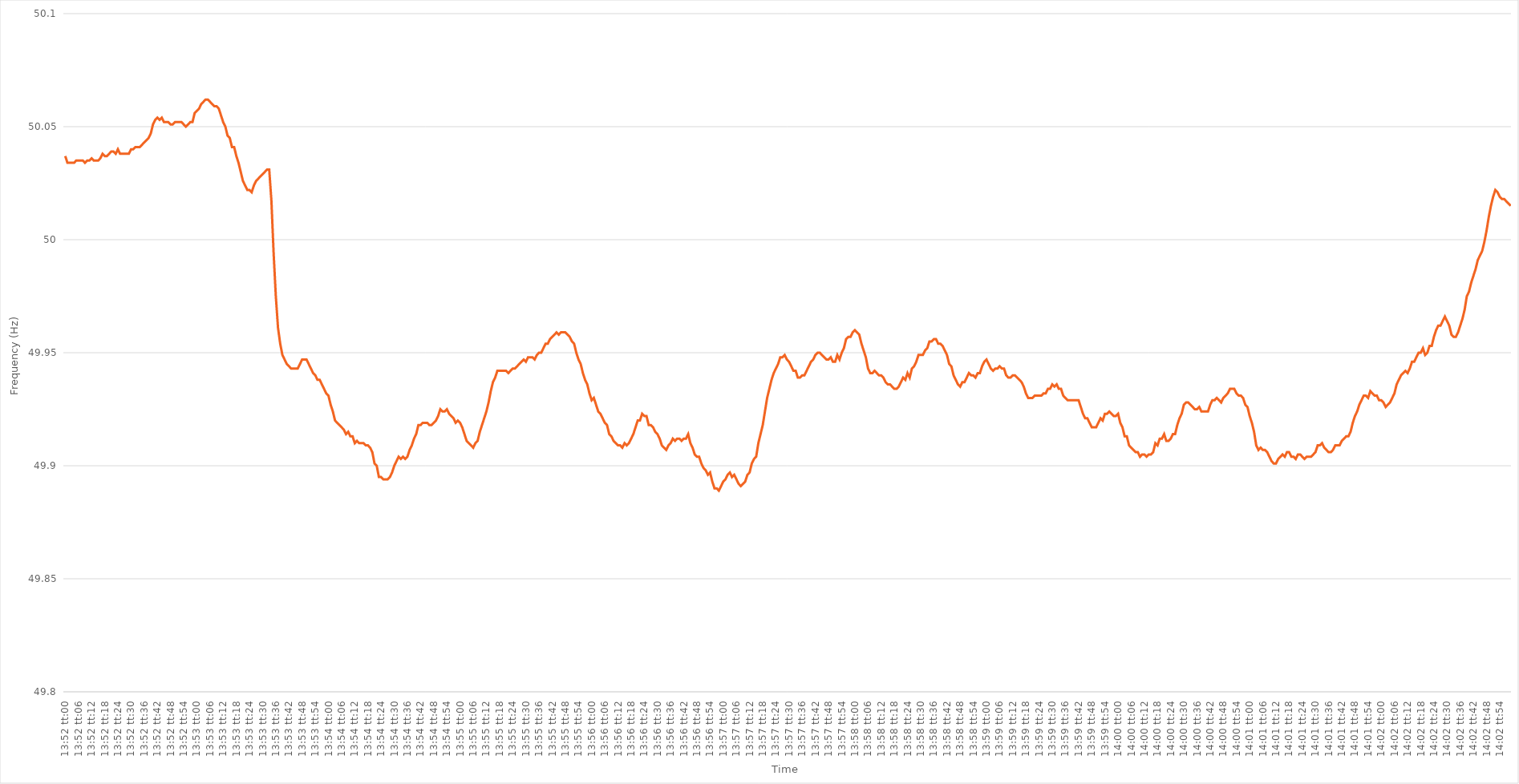
| Category | Series 0 |
|---|---|
| 0.5777777777777778 | 50.037 |
| 0.5777893518518519 | 50.034 |
| 0.5778009259259259 | 50.034 |
| 0.5778125 | 50.034 |
| 0.5778240740740741 | 50.034 |
| 0.5778356481481481 | 50.035 |
| 0.5778472222222223 | 50.035 |
| 0.5778587962962963 | 50.035 |
| 0.5778703703703704 | 50.035 |
| 0.5778819444444444 | 50.034 |
| 0.5778935185185184 | 50.035 |
| 0.5779050925925926 | 50.035 |
| 0.5779166666666666 | 50.036 |
| 0.5779282407407408 | 50.035 |
| 0.5779398148148148 | 50.035 |
| 0.5779513888888889 | 50.035 |
| 0.5779629629629629 | 50.036 |
| 0.577974537037037 | 50.038 |
| 0.5779861111111111 | 50.037 |
| 0.5779976851851852 | 50.037 |
| 0.5780092592592593 | 50.038 |
| 0.5780208333333333 | 50.039 |
| 0.5780324074074074 | 50.039 |
| 0.5780439814814815 | 50.038 |
| 0.5780555555555555 | 50.04 |
| 0.5780671296296297 | 50.038 |
| 0.5780787037037037 | 50.038 |
| 0.5780902777777778 | 50.038 |
| 0.5781018518518518 | 50.038 |
| 0.578113425925926 | 50.038 |
| 0.578125 | 50.04 |
| 0.578136574074074 | 50.04 |
| 0.5781481481481482 | 50.041 |
| 0.5781597222222222 | 50.041 |
| 0.5781712962962963 | 50.041 |
| 0.5781828703703703 | 50.042 |
| 0.5781944444444445 | 50.043 |
| 0.5782060185185185 | 50.044 |
| 0.5782175925925926 | 50.045 |
| 0.5782291666666667 | 50.047 |
| 0.5782407407407407 | 50.051 |
| 0.5782523148148148 | 50.053 |
| 0.5782638888888889 | 50.054 |
| 0.578275462962963 | 50.053 |
| 0.5782870370370371 | 50.054 |
| 0.5782986111111111 | 50.052 |
| 0.5783101851851852 | 50.052 |
| 0.5783217592592592 | 50.052 |
| 0.5783333333333334 | 50.051 |
| 0.5783449074074074 | 50.051 |
| 0.5783564814814816 | 50.052 |
| 0.5783680555555556 | 50.052 |
| 0.5783796296296296 | 50.052 |
| 0.5783912037037037 | 50.052 |
| 0.5784027777777777 | 50.051 |
| 0.5784143518518519 | 50.05 |
| 0.5784259259259259 | 50.051 |
| 0.5784375 | 50.052 |
| 0.5784490740740741 | 50.052 |
| 0.5784606481481481 | 50.056 |
| 0.5784722222222222 | 50.057 |
| 0.5784837962962963 | 50.058 |
| 0.5784953703703704 | 50.06 |
| 0.5785069444444445 | 50.061 |
| 0.5785185185185185 | 50.062 |
| 0.5785300925925926 | 50.062 |
| 0.5785416666666666 | 50.061 |
| 0.5785532407407408 | 50.06 |
| 0.5785648148148148 | 50.059 |
| 0.578576388888889 | 50.059 |
| 0.578587962962963 | 50.058 |
| 0.578599537037037 | 50.055 |
| 0.5786111111111111 | 50.052 |
| 0.5786226851851851 | 50.05 |
| 0.5786342592592593 | 50.046 |
| 0.5786458333333333 | 50.045 |
| 0.5786574074074075 | 50.041 |
| 0.5786689814814815 | 50.041 |
| 0.5786805555555555 | 50.037 |
| 0.5786921296296296 | 50.034 |
| 0.5787037037037037 | 50.03 |
| 0.5787152777777778 | 50.026 |
| 0.5787268518518519 | 50.024 |
| 0.578738425925926 | 50.022 |
| 0.57875 | 50.022 |
| 0.578761574074074 | 50.021 |
| 0.5787731481481482 | 50.024 |
| 0.5787847222222222 | 50.026 |
| 0.5787962962962964 | 50.027 |
| 0.5788078703703704 | 50.028 |
| 0.5788194444444444 | 50.029 |
| 0.5788310185185185 | 50.03 |
| 0.5788425925925925 | 50.031 |
| 0.5788541666666667 | 50.031 |
| 0.5788657407407407 | 50.017 |
| 0.5788773148148149 | 49.994 |
| 0.5788888888888889 | 49.975 |
| 0.5789004629629629 | 49.961 |
| 0.578912037037037 | 49.954 |
| 0.5789236111111111 | 49.949 |
| 0.5789351851851852 | 49.947 |
| 0.5789467592592593 | 49.945 |
| 0.5789583333333334 | 49.944 |
| 0.5789699074074074 | 49.943 |
| 0.5789814814814814 | 49.943 |
| 0.5789930555555556 | 49.943 |
| 0.5790046296296296 | 49.943 |
| 0.5790162037037038 | 49.945 |
| 0.5790277777777778 | 49.947 |
| 0.5790393518518518 | 49.947 |
| 0.5790509259259259 | 49.947 |
| 0.5790625 | 49.945 |
| 0.5790740740740741 | 49.943 |
| 0.5790856481481481 | 49.941 |
| 0.5790972222222223 | 49.94 |
| 0.5791087962962963 | 49.938 |
| 0.5791203703703703 | 49.938 |
| 0.5791319444444444 | 49.936 |
| 0.5791435185185185 | 49.934 |
| 0.5791550925925926 | 49.932 |
| 0.5791666666666667 | 49.931 |
| 0.5791782407407408 | 49.927 |
| 0.5791898148148148 | 49.924 |
| 0.5792013888888888 | 49.92 |
| 0.579212962962963 | 49.919 |
| 0.579224537037037 | 49.918 |
| 0.5792361111111112 | 49.917 |
| 0.5792476851851852 | 49.916 |
| 0.5792592592592593 | 49.914 |
| 0.5792708333333333 | 49.915 |
| 0.5792824074074074 | 49.913 |
| 0.5792939814814815 | 49.913 |
| 0.5793055555555556 | 49.91 |
| 0.5793171296296297 | 49.911 |
| 0.5793287037037037 | 49.91 |
| 0.5793402777777777 | 49.91 |
| 0.5793518518518518 | 49.91 |
| 0.5793634259259259 | 49.909 |
| 0.579375 | 49.909 |
| 0.5793865740740741 | 49.908 |
| 0.5793981481481482 | 49.906 |
| 0.5794097222222222 | 49.901 |
| 0.5794212962962962 | 49.9 |
| 0.5794328703703704 | 49.895 |
| 0.5794444444444444 | 49.895 |
| 0.5794560185185186 | 49.894 |
| 0.5794675925925926 | 49.894 |
| 0.5794791666666667 | 49.894 |
| 0.5794907407407407 | 49.895 |
| 0.5795023148148148 | 49.897 |
| 0.5795138888888889 | 49.9 |
| 0.579525462962963 | 49.902 |
| 0.5795370370370371 | 49.904 |
| 0.5795486111111111 | 49.903 |
| 0.5795601851851852 | 49.904 |
| 0.5795717592592592 | 49.903 |
| 0.5795833333333333 | 49.904 |
| 0.5795949074074074 | 49.907 |
| 0.5796064814814815 | 49.909 |
| 0.5796180555555556 | 49.912 |
| 0.5796296296296296 | 49.914 |
| 0.5796412037037036 | 49.918 |
| 0.5796527777777778 | 49.918 |
| 0.5796643518518518 | 49.919 |
| 0.579675925925926 | 49.919 |
| 0.5796875 | 49.919 |
| 0.5796990740740741 | 49.918 |
| 0.5797106481481481 | 49.918 |
| 0.5797222222222222 | 49.919 |
| 0.5797337962962963 | 49.92 |
| 0.5797453703703704 | 49.922 |
| 0.5797569444444445 | 49.925 |
| 0.5797685185185185 | 49.924 |
| 0.5797800925925926 | 49.924 |
| 0.5797916666666666 | 49.925 |
| 0.5798032407407407 | 49.923 |
| 0.5798148148148148 | 49.922 |
| 0.5798263888888889 | 49.921 |
| 0.579837962962963 | 49.919 |
| 0.579849537037037 | 49.92 |
| 0.579861111111111 | 49.919 |
| 0.5798726851851852 | 49.917 |
| 0.5798842592592592 | 49.914 |
| 0.5798958333333334 | 49.911 |
| 0.5799074074074074 | 49.91 |
| 0.5799189814814815 | 49.909 |
| 0.5799305555555555 | 49.908 |
| 0.5799421296296297 | 49.91 |
| 0.5799537037037037 | 49.911 |
| 0.5799652777777778 | 49.915 |
| 0.5799768518518519 | 49.918 |
| 0.5799884259259259 | 49.921 |
| 0.58 | 49.924 |
| 0.5800115740740741 | 49.928 |
| 0.5800231481481481 | 49.933 |
| 0.5800347222222222 | 49.937 |
| 0.5800462962962963 | 49.939 |
| 0.5800578703703704 | 49.942 |
| 0.5800694444444444 | 49.942 |
| 0.5800810185185185 | 49.942 |
| 0.5800925925925926 | 49.942 |
| 0.5801041666666666 | 49.942 |
| 0.5801157407407408 | 49.941 |
| 0.5801273148148148 | 49.942 |
| 0.5801388888888889 | 49.943 |
| 0.5801504629629629 | 49.943 |
| 0.5801620370370371 | 49.944 |
| 0.5801736111111111 | 49.945 |
| 0.5801851851851852 | 49.946 |
| 0.5801967592592593 | 49.947 |
| 0.5802083333333333 | 49.946 |
| 0.5802199074074074 | 49.948 |
| 0.5802314814814815 | 49.948 |
| 0.5802430555555556 | 49.948 |
| 0.5802546296296297 | 49.947 |
| 0.5802662037037037 | 49.949 |
| 0.5802777777777778 | 49.95 |
| 0.5802893518518518 | 49.95 |
| 0.5803009259259259 | 49.952 |
| 0.5803125 | 49.954 |
| 0.580324074074074 | 49.954 |
| 0.5803356481481482 | 49.956 |
| 0.5803472222222222 | 49.957 |
| 0.5803587962962963 | 49.958 |
| 0.5803703703703703 | 49.959 |
| 0.5803819444444445 | 49.958 |
| 0.5803935185185185 | 49.959 |
| 0.5804050925925927 | 49.959 |
| 0.5804166666666667 | 49.959 |
| 0.5804282407407407 | 49.958 |
| 0.5804398148148148 | 49.957 |
| 0.5804513888888889 | 49.955 |
| 0.580462962962963 | 49.954 |
| 0.5804745370370371 | 49.95 |
| 0.5804861111111111 | 49.947 |
| 0.5804976851851852 | 49.945 |
| 0.5805092592592592 | 49.941 |
| 0.5805208333333333 | 49.938 |
| 0.5805324074074074 | 49.936 |
| 0.5805439814814815 | 49.932 |
| 0.5805555555555556 | 49.929 |
| 0.5805671296296296 | 49.93 |
| 0.5805787037037037 | 49.927 |
| 0.5805902777777777 | 49.924 |
| 0.5806018518518519 | 49.923 |
| 0.5806134259259259 | 49.921 |
| 0.5806250000000001 | 49.919 |
| 0.5806365740740741 | 49.918 |
| 0.5806481481481481 | 49.914 |
| 0.5806597222222222 | 49.913 |
| 0.5806712962962963 | 49.911 |
| 0.5806828703703704 | 49.91 |
| 0.5806944444444445 | 49.909 |
| 0.5807060185185186 | 49.909 |
| 0.5807175925925926 | 49.908 |
| 0.5807291666666666 | 49.91 |
| 0.5807407407407407 | 49.909 |
| 0.5807523148148148 | 49.91 |
| 0.5807638888888889 | 49.912 |
| 0.580775462962963 | 49.914 |
| 0.580787037037037 | 49.917 |
| 0.5807986111111111 | 49.92 |
| 0.5808101851851851 | 49.92 |
| 0.5808217592592593 | 49.923 |
| 0.5808333333333333 | 49.922 |
| 0.5808449074074075 | 49.922 |
| 0.5808564814814815 | 49.918 |
| 0.5808680555555555 | 49.918 |
| 0.5808796296296296 | 49.917 |
| 0.5808912037037037 | 49.915 |
| 0.5809027777777778 | 49.914 |
| 0.5809143518518519 | 49.912 |
| 0.580925925925926 | 49.909 |
| 0.5809375 | 49.908 |
| 0.580949074074074 | 49.907 |
| 0.5809606481481482 | 49.909 |
| 0.5809722222222222 | 49.91 |
| 0.5809837962962963 | 49.912 |
| 0.5809953703703704 | 49.911 |
| 0.5810069444444445 | 49.912 |
| 0.5810185185185185 | 49.912 |
| 0.5810300925925925 | 49.911 |
| 0.5810416666666667 | 49.912 |
| 0.5810532407407407 | 49.912 |
| 0.5810648148148149 | 49.914 |
| 0.5810763888888889 | 49.91 |
| 0.581087962962963 | 49.908 |
| 0.581099537037037 | 49.905 |
| 0.5811111111111111 | 49.904 |
| 0.5811226851851852 | 49.904 |
| 0.5811342592592593 | 49.901 |
| 0.5811458333333334 | 49.899 |
| 0.5811574074074074 | 49.898 |
| 0.5811689814814814 | 49.896 |
| 0.5811805555555556 | 49.897 |
| 0.5811921296296296 | 49.893 |
| 0.5812037037037037 | 49.89 |
| 0.5812152777777778 | 49.89 |
| 0.5812268518518519 | 49.889 |
| 0.5812384259259259 | 49.891 |
| 0.5812499999999999 | 49.893 |
| 0.5812615740740741 | 49.894 |
| 0.5812731481481481 | 49.896 |
| 0.5812847222222223 | 49.897 |
| 0.5812962962962963 | 49.895 |
| 0.5813078703703703 | 49.896 |
| 0.5813194444444444 | 49.894 |
| 0.5813310185185185 | 49.892 |
| 0.5813425925925926 | 49.891 |
| 0.5813541666666667 | 49.892 |
| 0.5813657407407408 | 49.893 |
| 0.5813773148148148 | 49.896 |
| 0.5813888888888888 | 49.897 |
| 0.581400462962963 | 49.901 |
| 0.581412037037037 | 49.903 |
| 0.5814236111111112 | 49.904 |
| 0.5814351851851852 | 49.91 |
| 0.5814467592592593 | 49.914 |
| 0.5814583333333333 | 49.918 |
| 0.5814699074074073 | 49.924 |
| 0.5814814814814815 | 49.93 |
| 0.5814930555555555 | 49.934 |
| 0.5815046296296297 | 49.938 |
| 0.5815162037037037 | 49.941 |
| 0.5815277777777778 | 49.943 |
| 0.5815393518518518 | 49.945 |
| 0.5815509259259259 | 49.948 |
| 0.5815625 | 49.948 |
| 0.5815740740740741 | 49.949 |
| 0.5815856481481482 | 49.947 |
| 0.5815972222222222 | 49.946 |
| 0.5816087962962962 | 49.944 |
| 0.5816203703703704 | 49.942 |
| 0.5816319444444444 | 49.942 |
| 0.5816435185185186 | 49.939 |
| 0.5816550925925926 | 49.939 |
| 0.5816666666666667 | 49.94 |
| 0.5816782407407407 | 49.94 |
| 0.5816898148148147 | 49.942 |
| 0.5817013888888889 | 49.944 |
| 0.5817129629629629 | 49.946 |
| 0.5817245370370371 | 49.947 |
| 0.5817361111111111 | 49.949 |
| 0.5817476851851852 | 49.95 |
| 0.5817592592592592 | 49.95 |
| 0.5817708333333333 | 49.949 |
| 0.5817824074074074 | 49.948 |
| 0.5817939814814815 | 49.947 |
| 0.5818055555555556 | 49.947 |
| 0.5818171296296296 | 49.948 |
| 0.5818287037037037 | 49.946 |
| 0.5818402777777778 | 49.946 |
| 0.5818518518518518 | 49.949 |
| 0.581863425925926 | 49.947 |
| 0.581875 | 49.95 |
| 0.5818865740740741 | 49.952 |
| 0.5818981481481481 | 49.956 |
| 0.5819097222222223 | 49.957 |
| 0.5819212962962963 | 49.957 |
| 0.5819328703703703 | 49.959 |
| 0.5819444444444445 | 49.96 |
| 0.5819560185185185 | 49.959 |
| 0.5819675925925926 | 49.958 |
| 0.5819791666666666 | 49.954 |
| 0.5819907407407408 | 49.951 |
| 0.5820023148148148 | 49.948 |
| 0.5820138888888889 | 49.943 |
| 0.582025462962963 | 49.941 |
| 0.582037037037037 | 49.941 |
| 0.5820486111111111 | 49.942 |
| 0.5820601851851852 | 49.941 |
| 0.5820717592592592 | 49.94 |
| 0.5820833333333334 | 49.94 |
| 0.5820949074074074 | 49.939 |
| 0.5821064814814815 | 49.937 |
| 0.5821180555555555 | 49.936 |
| 0.5821296296296297 | 49.936 |
| 0.5821412037037037 | 49.935 |
| 0.5821527777777777 | 49.934 |
| 0.5821643518518519 | 49.934 |
| 0.5821759259259259 | 49.935 |
| 0.5821875 | 49.937 |
| 0.582199074074074 | 49.939 |
| 0.5822106481481482 | 49.938 |
| 0.5822222222222222 | 49.941 |
| 0.5822337962962963 | 49.939 |
| 0.5822453703703704 | 49.943 |
| 0.5822569444444444 | 49.944 |
| 0.5822685185185185 | 49.946 |
| 0.5822800925925926 | 49.949 |
| 0.5822916666666667 | 49.949 |
| 0.5823032407407408 | 49.949 |
| 0.5823148148148148 | 49.951 |
| 0.5823263888888889 | 49.952 |
| 0.5823379629629629 | 49.955 |
| 0.5823495370370371 | 49.955 |
| 0.5823611111111111 | 49.956 |
| 0.5823726851851853 | 49.956 |
| 0.5823842592592593 | 49.954 |
| 0.5823958333333333 | 49.954 |
| 0.5824074074074074 | 49.953 |
| 0.5824189814814814 | 49.951 |
| 0.5824305555555556 | 49.949 |
| 0.5824421296296296 | 49.945 |
| 0.5824537037037038 | 49.944 |
| 0.5824652777777778 | 49.94 |
| 0.5824768518518518 | 49.938 |
| 0.5824884259259259 | 49.936 |
| 0.5825 | 49.935 |
| 0.5825115740740741 | 49.937 |
| 0.5825231481481482 | 49.937 |
| 0.5825347222222222 | 49.939 |
| 0.5825462962962963 | 49.941 |
| 0.5825578703703703 | 49.94 |
| 0.5825694444444445 | 49.94 |
| 0.5825810185185185 | 49.939 |
| 0.5825925925925927 | 49.941 |
| 0.5826041666666667 | 49.941 |
| 0.5826157407407407 | 49.944 |
| 0.5826273148148148 | 49.946 |
| 0.5826388888888888 | 49.947 |
| 0.582650462962963 | 49.945 |
| 0.582662037037037 | 49.943 |
| 0.5826736111111112 | 49.942 |
| 0.5826851851851852 | 49.943 |
| 0.5826967592592592 | 49.943 |
| 0.5827083333333333 | 49.944 |
| 0.5827199074074074 | 49.943 |
| 0.5827314814814815 | 49.943 |
| 0.5827430555555556 | 49.94 |
| 0.5827546296296297 | 49.939 |
| 0.5827662037037037 | 49.939 |
| 0.5827777777777777 | 49.94 |
| 0.5827893518518519 | 49.94 |
| 0.5828009259259259 | 49.939 |
| 0.5828125000000001 | 49.938 |
| 0.5828240740740741 | 49.937 |
| 0.5828356481481481 | 49.935 |
| 0.5828472222222222 | 49.932 |
| 0.5828587962962963 | 49.93 |
| 0.5828703703703704 | 49.93 |
| 0.5828819444444444 | 49.93 |
| 0.5828935185185186 | 49.931 |
| 0.5829050925925926 | 49.931 |
| 0.5829166666666666 | 49.931 |
| 0.5829282407407407 | 49.931 |
| 0.5829398148148148 | 49.932 |
| 0.5829513888888889 | 49.932 |
| 0.582962962962963 | 49.934 |
| 0.582974537037037 | 49.934 |
| 0.5829861111111111 | 49.936 |
| 0.5829976851851851 | 49.935 |
| 0.5830092592592593 | 49.936 |
| 0.5830208333333333 | 49.934 |
| 0.5830324074074075 | 49.934 |
| 0.5830439814814815 | 49.931 |
| 0.5830555555555555 | 49.93 |
| 0.5830671296296296 | 49.929 |
| 0.5830787037037037 | 49.929 |
| 0.5830902777777778 | 49.929 |
| 0.5831018518518518 | 49.929 |
| 0.583113425925926 | 49.929 |
| 0.583125 | 49.929 |
| 0.583136574074074 | 49.926 |
| 0.5831481481481481 | 49.923 |
| 0.5831597222222222 | 49.921 |
| 0.5831712962962963 | 49.921 |
| 0.5831828703703704 | 49.919 |
| 0.5831944444444445 | 49.917 |
| 0.5832060185185185 | 49.917 |
| 0.5832175925925925 | 49.917 |
| 0.5832291666666667 | 49.919 |
| 0.5832407407407407 | 49.921 |
| 0.5832523148148149 | 49.92 |
| 0.5832638888888889 | 49.923 |
| 0.583275462962963 | 49.923 |
| 0.583287037037037 | 49.924 |
| 0.5832986111111111 | 49.923 |
| 0.5833101851851852 | 49.922 |
| 0.5833217592592593 | 49.922 |
| 0.5833333333333334 | 49.923 |
| 0.5833449074074074 | 49.919 |
| 0.5833564814814814 | 49.917 |
| 0.5833680555555555 | 49.913 |
| 0.5833796296296296 | 49.913 |
| 0.5833912037037037 | 49.909 |
| 0.5834027777777778 | 49.908 |
| 0.5834143518518519 | 49.907 |
| 0.5834259259259259 | 49.906 |
| 0.5834374999999999 | 49.906 |
| 0.5834490740740741 | 49.904 |
| 0.5834606481481481 | 49.905 |
| 0.5834722222222223 | 49.905 |
| 0.5834837962962963 | 49.904 |
| 0.5834953703703704 | 49.905 |
| 0.5835069444444444 | 49.905 |
| 0.5835185185185185 | 49.906 |
| 0.5835300925925926 | 49.91 |
| 0.5835416666666667 | 49.909 |
| 0.5835532407407408 | 49.912 |
| 0.5835648148148148 | 49.912 |
| 0.5835763888888889 | 49.914 |
| 0.5835879629629629 | 49.911 |
| 0.583599537037037 | 49.911 |
| 0.5836111111111111 | 49.912 |
| 0.5836226851851852 | 49.914 |
| 0.5836342592592593 | 49.914 |
| 0.5836458333333333 | 49.918 |
| 0.5836574074074073 | 49.921 |
| 0.5836689814814815 | 49.923 |
| 0.5836805555555555 | 49.927 |
| 0.5836921296296297 | 49.928 |
| 0.5837037037037037 | 49.928 |
| 0.5837152777777778 | 49.927 |
| 0.5837268518518518 | 49.926 |
| 0.583738425925926 | 49.925 |
| 0.58375 | 49.925 |
| 0.5837615740740741 | 49.926 |
| 0.5837731481481482 | 49.924 |
| 0.5837847222222222 | 49.924 |
| 0.5837962962962963 | 49.924 |
| 0.5838078703703703 | 49.924 |
| 0.5838194444444444 | 49.927 |
| 0.5838310185185185 | 49.929 |
| 0.5838425925925926 | 49.929 |
| 0.5838541666666667 | 49.93 |
| 0.5838657407407407 | 49.929 |
| 0.5838773148148148 | 49.928 |
| 0.5838888888888889 | 49.93 |
| 0.5839004629629629 | 49.931 |
| 0.5839120370370371 | 49.932 |
| 0.5839236111111111 | 49.934 |
| 0.5839351851851852 | 49.934 |
| 0.5839467592592592 | 49.934 |
| 0.5839583333333334 | 49.932 |
| 0.5839699074074074 | 49.931 |
| 0.5839814814814815 | 49.931 |
| 0.5839930555555556 | 49.93 |
| 0.5840046296296296 | 49.927 |
| 0.5840162037037037 | 49.926 |
| 0.5840277777777778 | 49.922 |
| 0.5840393518518519 | 49.919 |
| 0.5840509259259259 | 49.915 |
| 0.5840625 | 49.909 |
| 0.5840740740740741 | 49.907 |
| 0.5840856481481481 | 49.908 |
| 0.5840972222222222 | 49.907 |
| 0.5841087962962963 | 49.907 |
| 0.5841203703703703 | 49.906 |
| 0.5841319444444445 | 49.904 |
| 0.5841435185185185 | 49.902 |
| 0.5841550925925926 | 49.901 |
| 0.5841666666666666 | 49.901 |
| 0.5841782407407408 | 49.903 |
| 0.5841898148148148 | 49.904 |
| 0.584201388888889 | 49.905 |
| 0.584212962962963 | 49.904 |
| 0.584224537037037 | 49.906 |
| 0.5842361111111111 | 49.906 |
| 0.5842476851851852 | 49.904 |
| 0.5842592592592593 | 49.904 |
| 0.5842708333333334 | 49.903 |
| 0.5842824074074074 | 49.905 |
| 0.5842939814814815 | 49.905 |
| 0.5843055555555555 | 49.904 |
| 0.5843171296296296 | 49.903 |
| 0.5843287037037037 | 49.904 |
| 0.5843402777777778 | 49.904 |
| 0.5843518518518519 | 49.904 |
| 0.5843634259259259 | 49.905 |
| 0.584375 | 49.906 |
| 0.584386574074074 | 49.909 |
| 0.5843981481481482 | 49.909 |
| 0.5844097222222222 | 49.91 |
| 0.5844212962962964 | 49.908 |
| 0.5844328703703704 | 49.907 |
| 0.5844444444444444 | 49.906 |
| 0.5844560185185185 | 49.906 |
| 0.5844675925925926 | 49.907 |
| 0.5844791666666667 | 49.909 |
| 0.5844907407407408 | 49.909 |
| 0.5845023148148148 | 49.909 |
| 0.5845138888888889 | 49.911 |
| 0.5845254629629629 | 49.912 |
| 0.584537037037037 | 49.913 |
| 0.5845486111111111 | 49.913 |
| 0.5845601851851852 | 49.915 |
| 0.5845717592592593 | 49.919 |
| 0.5845833333333333 | 49.922 |
| 0.5845949074074074 | 49.924 |
| 0.5846064814814814 | 49.927 |
| 0.5846180555555556 | 49.929 |
| 0.5846296296296296 | 49.931 |
| 0.5846412037037038 | 49.931 |
| 0.5846527777777778 | 49.93 |
| 0.5846643518518518 | 49.933 |
| 0.5846759259259259 | 49.932 |
| 0.5846875 | 49.931 |
| 0.5846990740740741 | 49.931 |
| 0.5847106481481482 | 49.929 |
| 0.5847222222222223 | 49.929 |
| 0.5847337962962963 | 49.928 |
| 0.5847453703703703 | 49.926 |
| 0.5847569444444444 | 49.927 |
| 0.5847685185185185 | 49.928 |
| 0.5847800925925926 | 49.93 |
| 0.5847916666666667 | 49.932 |
| 0.5848032407407407 | 49.936 |
| 0.5848148148148148 | 49.938 |
| 0.5848263888888888 | 49.94 |
| 0.584837962962963 | 49.941 |
| 0.584849537037037 | 49.942 |
| 0.5848611111111112 | 49.941 |
| 0.5848726851851852 | 49.943 |
| 0.5848842592592592 | 49.946 |
| 0.5848958333333333 | 49.946 |
| 0.5849074074074074 | 49.948 |
| 0.5849189814814815 | 49.95 |
| 0.5849305555555556 | 49.95 |
| 0.5849421296296297 | 49.952 |
| 0.5849537037037037 | 49.949 |
| 0.5849652777777777 | 49.95 |
| 0.5849768518518519 | 49.953 |
| 0.5849884259259259 | 49.953 |
| 0.585 | 49.957 |
| 0.5850115740740741 | 49.96 |
| 0.5850231481481482 | 49.962 |
| 0.5850347222222222 | 49.962 |
| 0.5850462962962962 | 49.964 |
| 0.5850578703703704 | 49.966 |
| 0.5850694444444444 | 49.964 |
| 0.5850810185185186 | 49.962 |
| 0.5850925925925926 | 49.958 |
| 0.5851041666666666 | 49.957 |
| 0.5851157407407407 | 49.957 |
| 0.5851273148148148 | 49.959 |
| 0.5851388888888889 | 49.962 |
| 0.585150462962963 | 49.965 |
| 0.5851620370370371 | 49.969 |
| 0.5851736111111111 | 49.975 |
| 0.5851851851851851 | 49.977 |
| 0.5851967592592593 | 49.981 |
| 0.5852083333333333 | 49.984 |
| 0.5852199074074075 | 49.987 |
| 0.5852314814814815 | 49.991 |
| 0.5852430555555556 | 49.993 |
| 0.5852546296296296 | 49.995 |
| 0.5852662037037036 | 49.999 |
| 0.5852777777777778 | 50.004 |
| 0.5852893518518518 | 50.01 |
| 0.585300925925926 | 50.015 |
| 0.5853125 | 50.019 |
| 0.585324074074074 | 50.022 |
| 0.5853356481481481 | 50.021 |
| 0.5853472222222222 | 50.019 |
| 0.5853587962962963 | 50.018 |
| 0.5853703703703704 | 50.018 |
| 0.5853819444444445 | 50.017 |
| 0.5853935185185185 | 50.016 |
| 0.5854050925925925 | 50.015 |